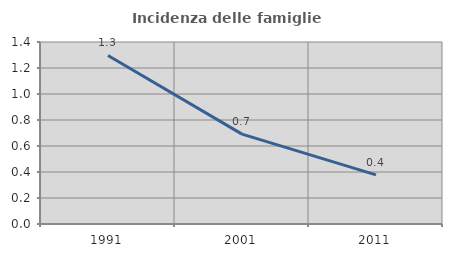
| Category | Incidenza delle famiglie numerose |
|---|---|
| 1991.0 | 1.297 |
| 2001.0 | 0.692 |
| 2011.0 | 0.378 |